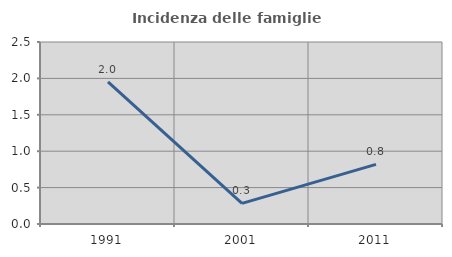
| Category | Incidenza delle famiglie numerose |
|---|---|
| 1991.0 | 1.953 |
| 2001.0 | 0.283 |
| 2011.0 | 0.819 |